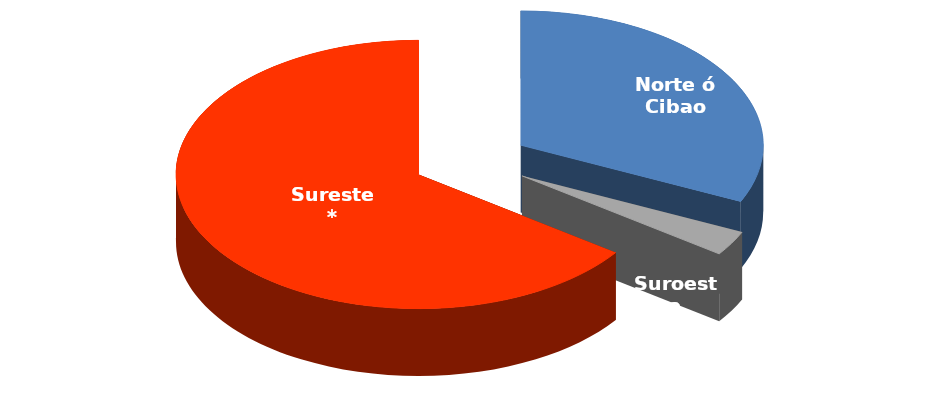
| Category | CANTIDAD |
|---|---|
| Norte ó Cibao | 96 |
| Suroeste | 9 |
| Sureste* | 196 |